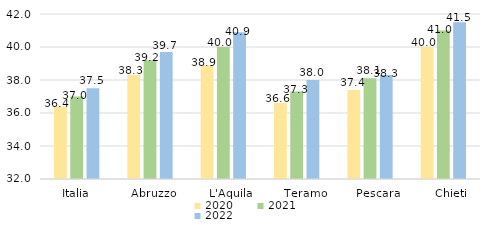
| Category | 2020 | 2021 | 2022 |
|---|---|---|---|
| Italia | 36.4 | 37 | 37.5 |
|   Abruzzo | 38.3 | 39.2 | 39.7 |
|     L'Aquila | 38.9 | 40 | 40.9 |
|     Teramo | 36.6 | 37.3 | 38 |
|     Pescara | 37.4 | 38.1 | 38.3 |
|     Chieti | 40 | 41 | 41.5 |